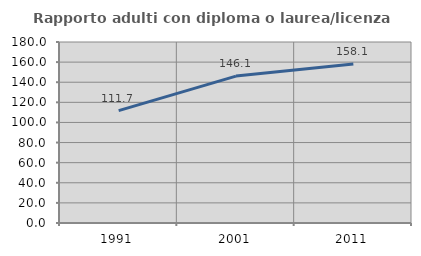
| Category | Rapporto adulti con diploma o laurea/licenza media  |
|---|---|
| 1991.0 | 111.728 |
| 2001.0 | 146.087 |
| 2011.0 | 158.058 |